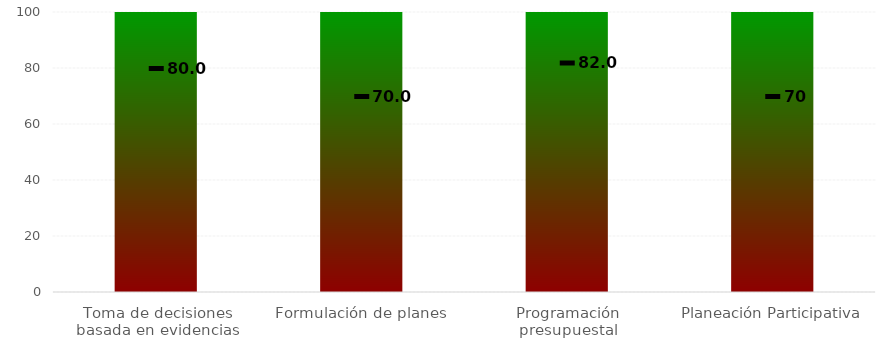
| Category | Series 0 |
|---|---|
| Toma de decisiones basada en evidencias | 100 |
| Formulación de planes | 100 |
| Programación presupuestal | 100 |
| Planeación Participativa | 100 |